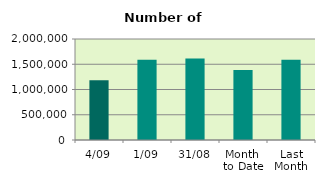
| Category | Series 0 |
|---|---|
| 4/09 | 1184690 |
| 1/09 | 1587052 |
| 31/08 | 1613612 |
| Month 
to Date | 1385871 |
| Last
Month | 1590000.087 |